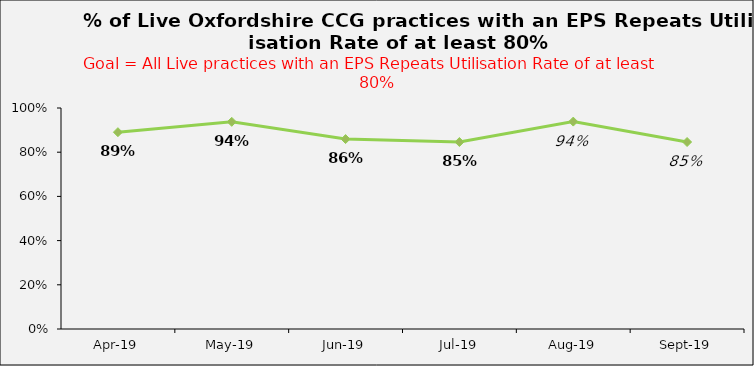
| Category | Series 0 |
|---|---|
| 2019-04-01 | 0.891 |
| 2019-05-01 | 0.938 |
| 2019-06-01 | 0.859 |
| 2019-07-01 | 0.846 |
| 2019-08-01 | 0.938 |
| 2019-09-01 | 0.846 |